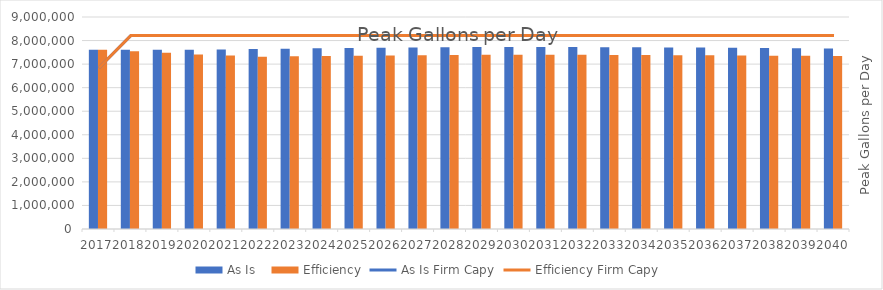
| Category | As Is   | Efficiency |
|---|---|---|
| 2017.0 | 7604412.26 | 7604412.26 |
| 2018.0 | 7606027.247 | 7541391.854 |
| 2019.0 | 7606849.493 | 7477564.732 |
| 2020.0 | 7606894.692 | 7412966.397 |
| 2021.0 | 7623853.592 | 7364706.071 |
| 2022.0 | 7639712.625 | 7315104.38 |
| 2023.0 | 7654492.092 | 7329255.874 |
| 2024.0 | 7668211.999 | 7342392.827 |
| 2025.0 | 7680892.058 | 7354534.115 |
| 2026.0 | 7692551.695 | 7365698.339 |
| 2027.0 | 7703210.049 | 7375903.825 |
| 2028.0 | 7712885.982 | 7385168.631 |
| 2029.0 | 7721598.075 | 7393510.55 |
| 2030.0 | 7729364.637 | 7400947.115 |
| 2031.0 | 7726187.909 | 7397905.364 |
| 2032.0 | 7722301.778 | 7394184.354 |
| 2033.0 | 7717720.752 | 7389797.973 |
| 2034.0 | 7712459.116 | 7384759.902 |
| 2035.0 | 7706530.94 | 7379083.612 |
| 2036.0 | 7699950.082 | 7372782.372 |
| 2037.0 | 7692730.189 | 7365869.249 |
| 2038.0 | 7684884.698 | 7358357.11 |
| 2039.0 | 7676426.844 | 7350258.626 |
| 2040.0 | 7667369.658 | 7341586.277 |